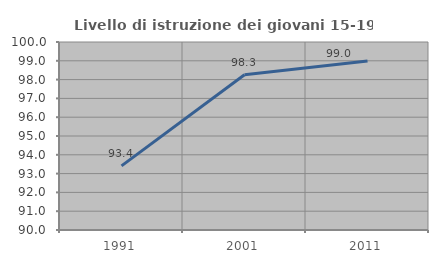
| Category | Livello di istruzione dei giovani 15-19 anni |
|---|---|
| 1991.0 | 93.413 |
| 2001.0 | 98.258 |
| 2011.0 | 98.99 |